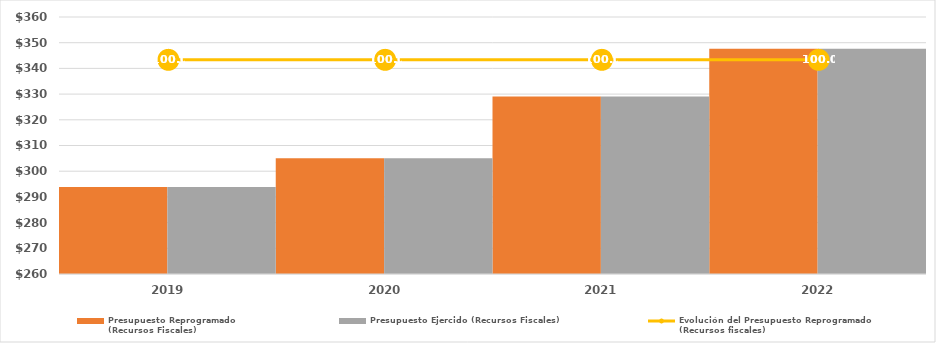
| Category | Presupuesto Reprogramado
(Recursos Fiscales) | Presupuesto Ejercido (Recursos Fiscales) |
|---|---|---|
| 2019.0 | 293830.853 | 293830.853 |
| 2020.0 | 305075.357 | 305075.357 |
| 2021.0 | 329095.471 | 329095.471 |
| 2022.0 | 347679.642 | 347679.642 |